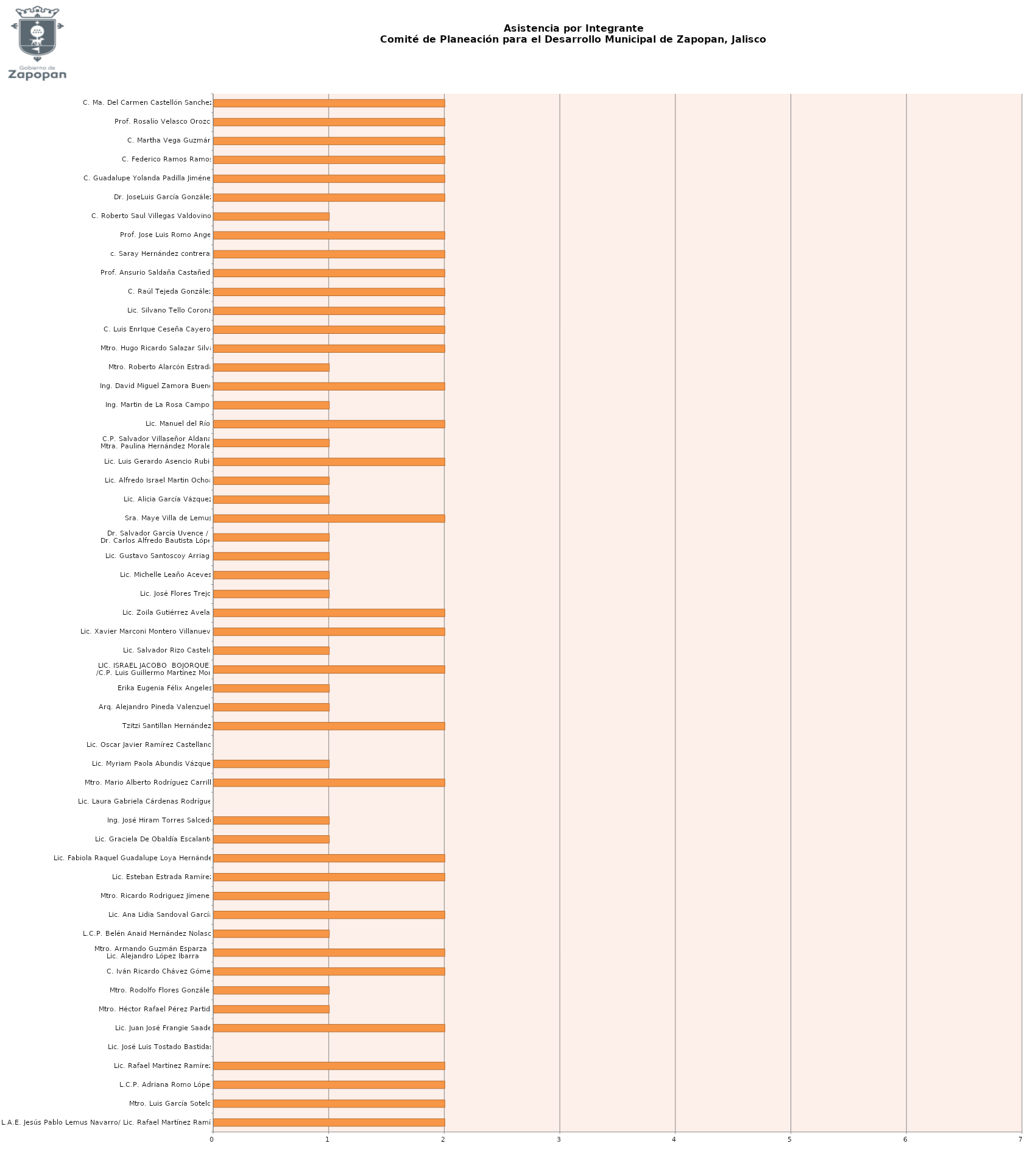
| Category | Series 0 |
|---|---|
| L.A.E. Jesús Pablo Lemus Navarro/ Lic. Rafael Martínez Ramírez | 2 |
| Mtro. Luis García Sotelo | 2 |
| L.C.P. Adriana Romo López | 2 |
| Lic. Rafael Martínez Ramírez | 2 |
| Lic. José Luis Tostado Bastidas | 0 |
| Lic. Juan José Frangie Saade | 2 |
| Mtro. Héctor Rafael Pérez Partida | 1 |
| Mtro. Rodolfo Flores González | 1 |
| C. Iván Ricardo Chávez Gómez | 2 |
| Mtro. Armando Guzmán Esparza / 
Lic. Alejandro López Ibarra | 2 |
| L.C.P. Belén Anaid Hernández Nolasco | 1 |
| Lic. Ana Lidia Sandoval García | 2 |
| Mtro. Ricardo Rodriguez Jímenez | 1 |
| Lic. Esteban Estrada Ramírez | 2 |
| Lic. Fabiola Raquel Guadalupe Loya Hernández | 2 |
| Lic. Graciela De Obaldía Escalante | 1 |
| Ing. José Hiram Torres Salcedo | 1 |
| Lic. Laura Gabriela Cárdenas Rodríguez | 0 |
| Mtro. Mario Alberto Rodríguez Carrillo | 2 |
| Lic. Myriam Paola Abundis Vázquez | 1 |
| Lic. Oscar Javier Ramírez Castellanos | 0 |
| Tzitzi Santillan Hernández | 2 |
| Arq. Alejandro Pineda Valenzuela | 1 |
| Erika Eugenia Félix Ángeles | 1 |
| LIC. ISRAEL JACOBO  BOJORQUEZ
/C.P. Luis Guillermo Martínez Mora | 2 |
| Lic. Salvador Rizo Castelo | 1 |
| Lic. Xavier Marconi Montero Villanueva | 2 |
| Lic. Zoila Gutiérrez Avelar | 2 |
| Lic. José Flores Trejo | 1 |
| Lic. Michelle Leaño Aceves | 1 |
| Lic. Gustavo Santoscoy Arriaga | 1 |
| Dr. Salvador García Uvence /
Dr. Carlos Alfredo Bautista López | 1 |
| Sra. Maye Villa de Lemus | 2 |
| Lic. Alicia García Vázquez | 1 |
| Lic. Alfredo Israel Martin Ochoa | 1 |
| Lic. Luis Gerardo Asencio Rubio | 2 |
| C.P. Salvador Villaseñor Aldana/
Mtra. Paulina Hernández Morales | 1 |
| Lic. Manuel del Río | 2 |
| Ing. Martin de La Rosa Campos | 1 |
| Ing. David Miguel Zamora Bueno | 2 |
| Mtro. Roberto Alarcón Estrada | 1 |
| Mtro. Hugo Ricardo Salazar Silva | 2 |
| C. Luis EnrIque Ceseña Cayeros | 2 |
| Lic. Silvano Tello Corona | 2 |
| C. Raúl Tejeda González | 2 |
| Prof. Ansurio Saldaña Castañeda | 2 |
| c. Saray Hernández contreras | 2 |
| Prof. Jose Luis Romo Angel | 2 |
| C. Roberto Saul Villegas Valdovinos | 1 |
| Dr. JoseLuis García González | 2 |
| C. Guadalupe Yolanda Padilla Jiménez | 2 |
| C. Federico Ramos Ramos | 2 |
| C. Martha Vega Guzmán | 2 |
| Prof. Rosalío Velasco Orozco | 2 |
| C. Ma. Del Carmen Castellón Sanchez. | 2 |